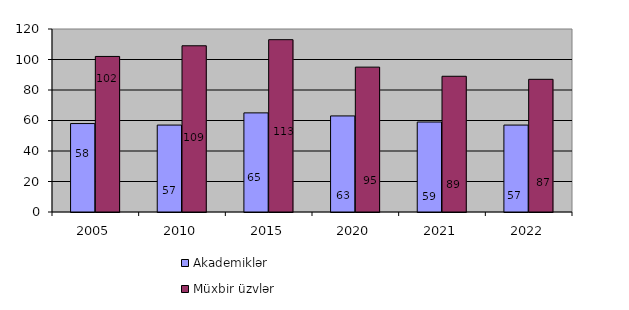
| Category | Akademiklər | Müxbir üzvlər |
|---|---|---|
| 2005.0 | 58 | 102 |
| 2010.0 | 57 | 109 |
| 2015.0 | 65 | 113 |
| 2020.0 | 63 | 95 |
| 2021.0 | 59 | 89 |
| 2022.0 | 57 | 87 |